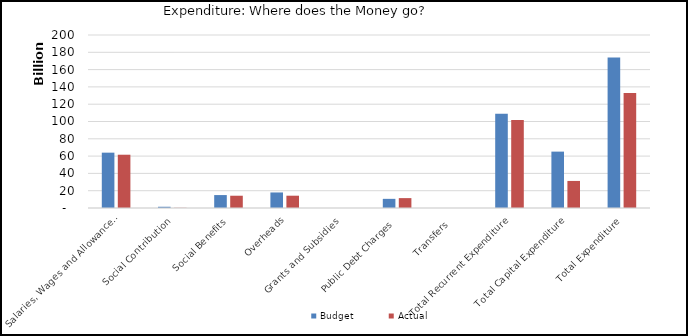
| Category | Budget | Actual |
|---|---|---|
| Salaries, Wages and Allowances (inc. CRF) | 63978196033 | 61595894584 |
| Social Contribution | 1430000000 | 204242683 |
| Social Benefits  | 14947984916.46 | 14190006465.81 |
| Overheads | 17968918682 | 14214231532.99 |
| Grants and Subsidies | 0 | 0 |
| Public Debt Charges  | 10580000000 | 11428713233 |
| Transfers  | 0 | 0 |
| Total Recurrent Expenditure  | 108905099631.46 | 101633088498.8 |
| Total Capital Expenditure  | 65182353610 | 31278902357.1 |
| Total Expenditure  | 174087453241.46 | 132911990855.9 |